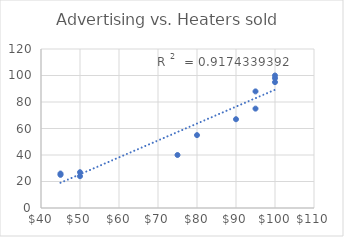
| Category | Series 0 |
|---|---|
| 100.0 | 98 |
| 100.0 | 100 |
| 95.0 | 75 |
| 90.0 | 67 |
| 50.0 | 24 |
| 45.0 | 26 |
| 45.0 | 25 |
| 50.0 | 27 |
| 75.0 | 40 |
| 80.0 | 55 |
| 95.0 | 88 |
| 100.0 | 95 |